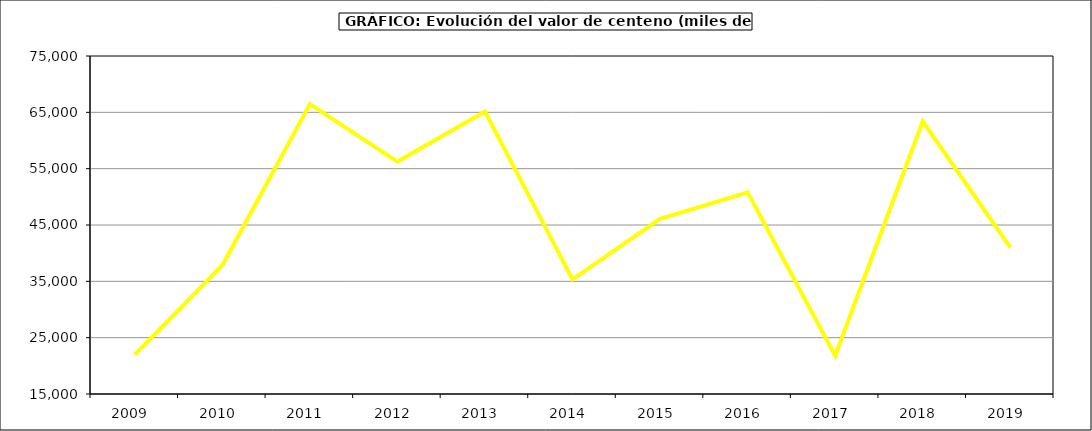
| Category | Valor |
|---|---|
| 2009.0 | 22005.119 |
| 2010.0 | 37852.67 |
| 2011.0 | 66477.888 |
| 2012.0 | 56263.16 |
| 2013.0 | 65145.46 |
| 2014.0 | 35358 |
| 2015.0 | 46088 |
| 2016.0 | 50792 |
| 2017.0 | 21795.275 |
| 2018.0 | 63397.814 |
| 2019.0 | 41041.209 |